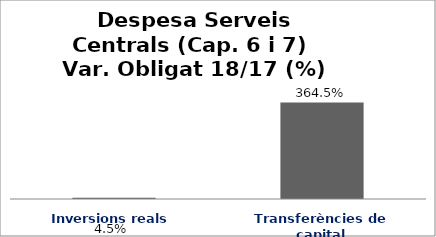
| Category | Series 0 |
|---|---|
| Inversions reals | 0.045 |
| Transferències de capital | 3.645 |